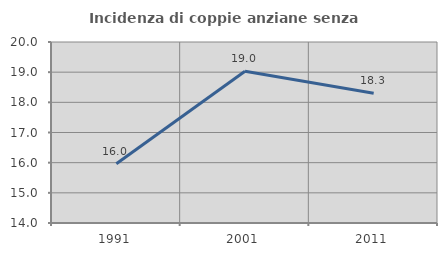
| Category | Incidenza di coppie anziane senza figli  |
|---|---|
| 1991.0 | 15.965 |
| 2001.0 | 19.031 |
| 2011.0 | 18.302 |